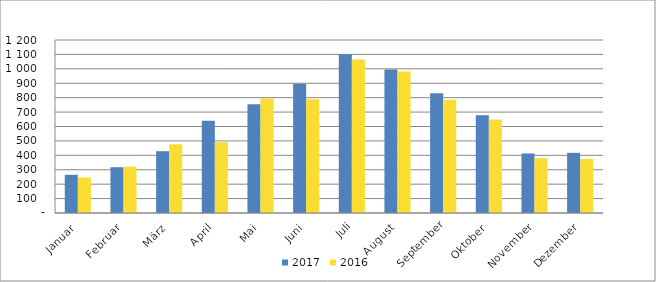
| Category | 2017 | 2016 |
|---|---|---|
| Januar | 264826 | 245865 |
| Februar | 317453 | 321172 |
| März | 428573 | 476687 |
| April | 640026 | 490831 |
| Mai | 753521 | 793441 |
| Juni | 896995 | 788407 |
| Juli | 1100643 | 1065529 |
| August | 994784 | 982065 |
| September | 830342 | 784786 |
| Oktober | 677910 | 648274 |
| November | 412819 | 380327 |
| Dezember | 417266 | 374908 |